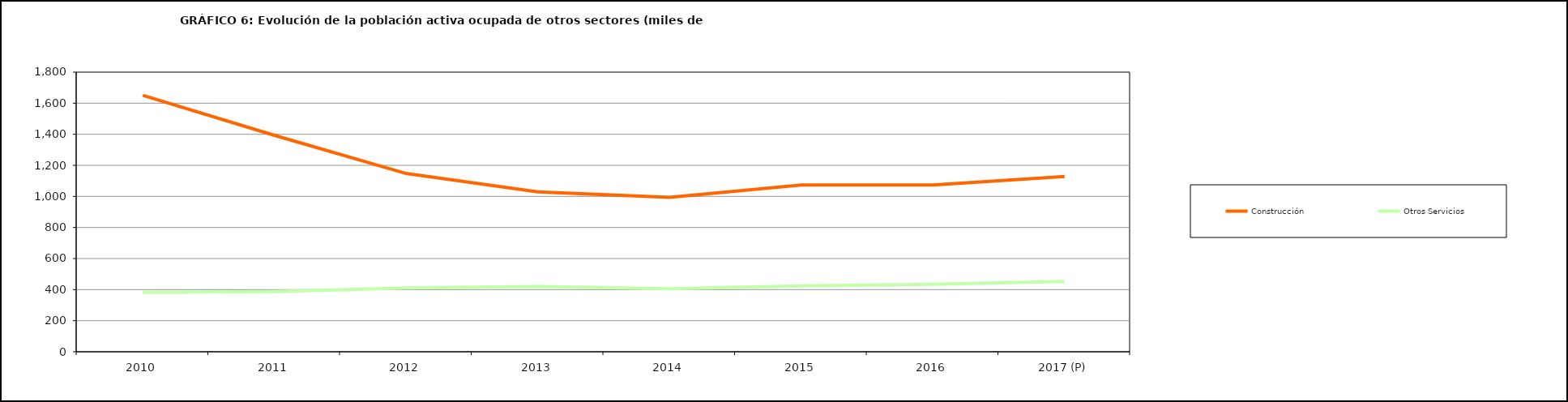
| Category | Construcción | Otros Servicios |
|---|---|---|
| 2010 | 1650.825 | 382 |
| 2011 | 1392.95 | 387.25 |
| 2012 | 1147.575 | 410.85 |
| 2013 | 1029.6 | 419.6 |
| 2014 | 993.5 | 405.475 |
| 2015 | 1073.65 | 424.325 |
| 2016 | 1073.9 | 434.6 |
| 2017 (P) | 1128.3 | 452.7 |